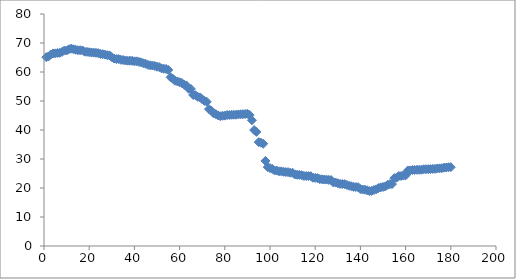
| Category | Series 0 |
|---|---|
| 1.0 | 65.116 |
| 2.0 | 65.354 |
| 3.0 | 66.014 |
| 4.0 | 66.393 |
| 5.0 | 66.425 |
| 6.0 | 66.543 |
| 7.0 | 66.606 |
| 8.0 | 66.949 |
| 9.0 | 67.389 |
| 10.0 | 67.403 |
| 11.0 | 67.84 |
| 12.0 | 68.047 |
| 13.0 | 67.868 |
| 14.0 | 67.683 |
| 15.0 | 67.512 |
| 16.0 | 67.494 |
| 17.0 | 67.445 |
| 18.0 | 67.004 |
| 19.0 | 66.94 |
| 20.0 | 66.836 |
| 21.0 | 66.728 |
| 22.0 | 66.678 |
| 23.0 | 66.613 |
| 24.0 | 66.496 |
| 25.0 | 66.226 |
| 26.0 | 66.144 |
| 27.0 | 65.999 |
| 28.0 | 65.792 |
| 29.0 | 65.725 |
| 30.0 | 65.116 |
| 31.0 | 64.646 |
| 32.0 | 64.47 |
| 33.0 | 64.457 |
| 34.0 | 64.203 |
| 35.0 | 64.154 |
| 36.0 | 63.971 |
| 37.0 | 63.915 |
| 38.0 | 63.908 |
| 39.0 | 63.849 |
| 40.0 | 63.68 |
| 41.0 | 63.669 |
| 42.0 | 63.488 |
| 43.0 | 63.315 |
| 44.0 | 63.002 |
| 45.0 | 62.83 |
| 46.0 | 62.459 |
| 47.0 | 62.287 |
| 48.0 | 62.24 |
| 49.0 | 62.082 |
| 50.0 | 61.825 |
| 51.0 | 61.687 |
| 52.0 | 61.255 |
| 53.0 | 61.118 |
| 54.0 | 61.047 |
| 55.0 | 60.716 |
| 56.0 | 58.174 |
| 57.0 | 57.681 |
| 58.0 | 56.989 |
| 59.0 | 56.759 |
| 60.0 | 56.47 |
| 61.0 | 56.201 |
| 62.0 | 55.634 |
| 63.0 | 55.383 |
| 64.0 | 54.218 |
| 65.0 | 54.167 |
| 66.0 | 52.093 |
| 67.0 | 52.005 |
| 68.0 | 51.458 |
| 69.0 | 51.252 |
| 70.0 | 50.6 |
| 71.0 | 50.051 |
| 72.0 | 49.747 |
| 73.0 | 47.224 |
| 74.0 | 46.686 |
| 75.0 | 45.768 |
| 76.0 | 45.491 |
| 77.0 | 45.044 |
| 78.0 | 44.767 |
| 79.0 | 44.916 |
| 80.0 | 44.963 |
| 81.0 | 45.158 |
| 82.0 | 45.174 |
| 83.0 | 45.237 |
| 84.0 | 45.264 |
| 85.0 | 45.27 |
| 86.0 | 45.373 |
| 87.0 | 45.423 |
| 88.0 | 45.467 |
| 89.0 | 45.504 |
| 90.0 | 45.581 |
| 91.0 | 45.165 |
| 92.0 | 43.364 |
| 93.0 | 39.969 |
| 94.0 | 39.369 |
| 95.0 | 35.823 |
| 96.0 | 35.617 |
| 97.0 | 35.249 |
| 98.0 | 29.327 |
| 99.0 | 27.211 |
| 100.0 | 26.875 |
| 101.0 | 26.607 |
| 102.0 | 26.047 |
| 103.0 | 26.003 |
| 104.0 | 25.75 |
| 105.0 | 25.749 |
| 106.0 | 25.595 |
| 107.0 | 25.492 |
| 108.0 | 25.475 |
| 109.0 | 25.268 |
| 110.0 | 25.263 |
| 111.0 | 24.663 |
| 112.0 | 24.576 |
| 113.0 | 24.535 |
| 114.0 | 24.419 |
| 115.0 | 24.144 |
| 116.0 | 24.134 |
| 117.0 | 24.099 |
| 118.0 | 24.094 |
| 119.0 | 23.529 |
| 120.0 | 23.495 |
| 121.0 | 23.427 |
| 122.0 | 23.073 |
| 123.0 | 23.007 |
| 124.0 | 22.927 |
| 125.0 | 22.889 |
| 126.0 | 22.791 |
| 127.0 | 22.752 |
| 128.0 | 21.953 |
| 129.0 | 21.882 |
| 130.0 | 21.635 |
| 131.0 | 21.403 |
| 132.0 | 21.367 |
| 133.0 | 21.324 |
| 134.0 | 21.062 |
| 135.0 | 20.757 |
| 136.0 | 20.608 |
| 137.0 | 20.387 |
| 138.0 | 20.349 |
| 139.0 | 20.281 |
| 140.0 | 19.628 |
| 141.0 | 19.463 |
| 142.0 | 19.416 |
| 143.0 | 19.216 |
| 144.0 | 18.937 |
| 145.0 | 19.011 |
| 146.0 | 19.317 |
| 147.0 | 19.534 |
| 148.0 | 19.979 |
| 149.0 | 20.236 |
| 150.0 | 20.349 |
| 151.0 | 20.535 |
| 152.0 | 21.078 |
| 153.0 | 21.324 |
| 154.0 | 21.364 |
| 155.0 | 23.421 |
| 156.0 | 23.546 |
| 157.0 | 24.145 |
| 158.0 | 24.146 |
| 159.0 | 24.326 |
| 160.0 | 24.343 |
| 161.0 | 26.041 |
| 162.0 | 26.047 |
| 163.0 | 26.184 |
| 164.0 | 26.225 |
| 165.0 | 26.264 |
| 166.0 | 26.265 |
| 167.0 | 26.305 |
| 168.0 | 26.468 |
| 169.0 | 26.477 |
| 170.0 | 26.486 |
| 171.0 | 26.536 |
| 172.0 | 26.573 |
| 173.0 | 26.597 |
| 174.0 | 26.72 |
| 175.0 | 26.783 |
| 176.0 | 26.811 |
| 177.0 | 27.024 |
| 178.0 | 27.054 |
| 179.0 | 27.168 |
| 180.0 | 27.189 |